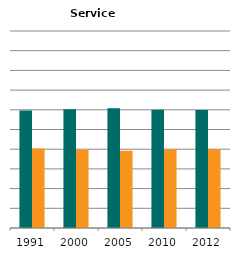
| Category | Male | Female |
|---|---|---|
| 1991.0 | 0.597 | 0.403 |
| 2000.0 | 0.602 | 0.398 |
| 2005.0 | 0.608 | 0.392 |
| 2010.0 | 0.601 | 0.399 |
| 2012.0 | 0.599 | 0.401 |